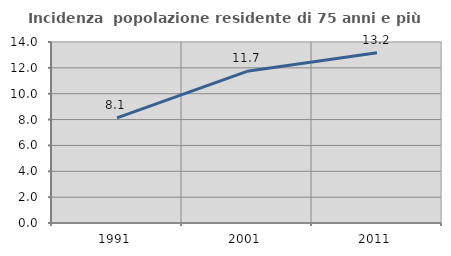
| Category | Incidenza  popolazione residente di 75 anni e più |
|---|---|
| 1991.0 | 8.132 |
| 2001.0 | 11.73 |
| 2011.0 | 13.169 |